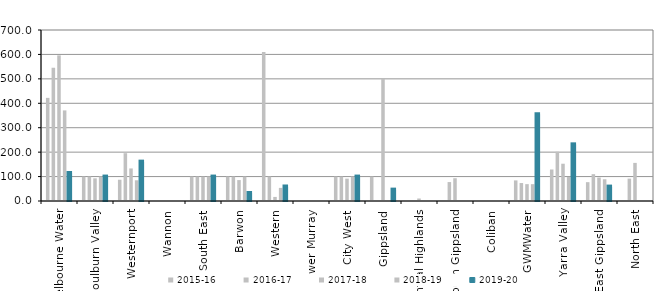
| Category | 2015-16 | 2016-17 | 2017-18 | 2018-19 | 2019-20 |
|---|---|---|---|---|---|
| Melbourne Water | 422.178 | 545.831 | 596.133 | 370.85 | 114.547 |
| Goulburn Valley | 100 | 100 | 92.851 | 100 | 100 |
| Westernport | 87.071 | 195.758 | 133.23 | 84.751 | 161.14 |
| Wannon | 0 | 0 | 0 | 0 | 0 |
| South East | 100 | 100 | 99.577 | 100 | 100 |
| Barwon | 100 | 100 | 85.645 | 100 | 32.821 |
| Western | 610.292 | 100 | 16.71 | 53.715 | 59.407 |
| Lower Murray | 0 | 0 | 0 | 0 | 0 |
| City West | 100 | 100 | 91.564 | 100 | 100 |
| Gippsland | 100 | 0 | 500 | 0 | 46.585 |
| Central Highlands | 0 | 0 | 10.256 | 0 | 0 |
| South Gippsland | 0 | 77.508 | 93.21 | 0 | 0 |
| Coliban | 0 | 0 | 0 | 0 | 0 |
| GWMWater | 84.354 | 73.52 | 69.022 | 68.939 | 355.15 |
| Yarra Valley | 129.001 | 201.599 | 152.647 | 98.541 | 231.922 |
| East Gippsland | 77.119 | 109.778 | 96.034 | 88.991 | 58.987 |
| North East | 0 | 91.585 | 155.988 | 0 | 0 |